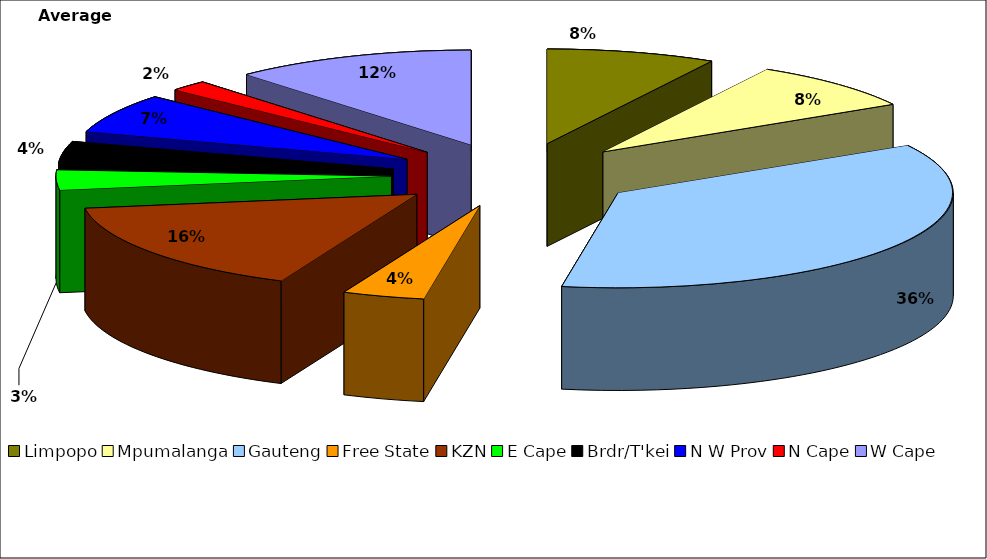
| Category | Average 2008 |
|---|---|
| Limpopo | 91572.08 |
| Mpumalanga | 95048.792 |
| Gauteng | 404819.183 |
| Free State | 44412.12 |
| KZN | 179746.96 |
| E Cape | 38374.309 |
| Brdr/T'kei | 40893.044 |
| N W Prov | 75871.792 |
| N Cape | 20931.527 |
| W Cape | 131068.096 |